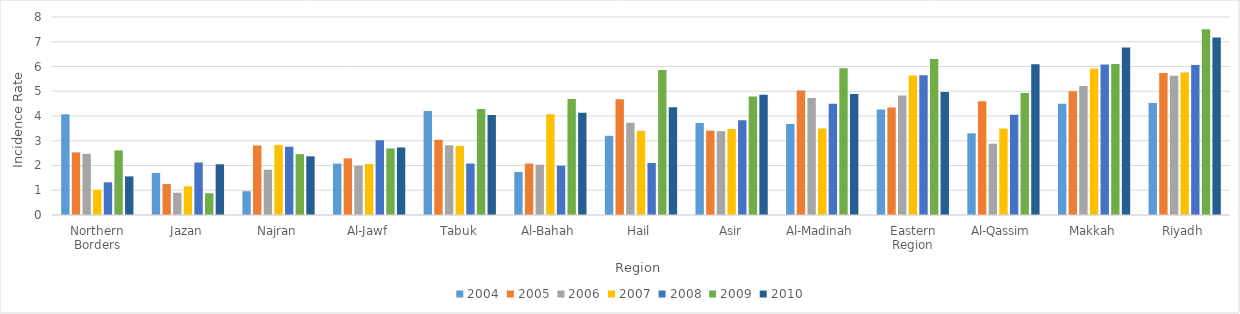
| Category | 2004 | 2005 | 2006 | 2007 | 2008 | 2009 | 2010 |
|---|---|---|---|---|---|---|---|
| Northern Borders | 4.07 | 2.53 | 2.47 | 1.02 | 1.32 | 2.61 | 1.56 |
| Jazan | 1.7 | 1.25 | 0.9 | 1.16 | 2.12 | 0.88 | 2.05 |
| Najran | 0.96 | 2.81 | 1.83 | 2.83 | 2.76 | 2.46 | 2.37 |
| Al-Jawf | 2.08 | 2.29 | 1.99 | 2.06 | 3.02 | 2.69 | 2.73 |
| Tabuk | 4.2 | 3.04 | 2.82 | 2.79 | 2.08 | 4.28 | 4.04 |
| Al-Bahah | 1.74 | 2.08 | 2.03 | 4.07 | 1.99 | 4.69 | 4.13 |
| Hail | 3.2 | 4.68 | 3.73 | 3.4 | 2.1 | 5.86 | 4.35 |
| Asir | 3.72 | 3.41 | 3.39 | 3.47 | 3.83 | 4.79 | 4.86 |
| Al-Madinah | 3.68 | 5.03 | 4.73 | 3.49 | 4.49 | 5.93 | 4.89 |
| Eastern Region | 4.26 | 4.34 | 4.83 | 5.64 | 5.65 | 6.3 | 4.97 |
| Al-Qassim | 3.3 | 4.6 | 2.88 | 3.5 | 4.05 | 4.93 | 6.09 |
| Makkah | 4.49 | 5 | 5.21 | 5.92 | 6.08 | 6.1 | 6.77 |
| Riyadh | 4.53 | 5.74 | 5.63 | 5.76 | 6.06 | 7.51 | 7.17 |